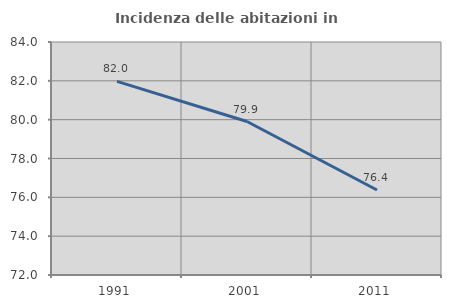
| Category | Incidenza delle abitazioni in proprietà  |
|---|---|
| 1991.0 | 81.969 |
| 2001.0 | 79.903 |
| 2011.0 | 76.377 |